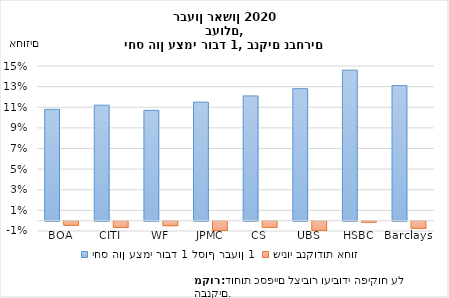
| Category | יחס הון עצמי רובד 1 לסוף רבעון 1 | שינוי בנקודות אחוז |
|---|---|---|
| BOA | 0.108 | -0.004 |
| CITI | 0.112 | -0.006 |
| WF | 0.107 | -0.004 |
| JPMC | 0.115 | -0.009 |
| CS | 0.121 | -0.006 |
| UBS | 0.128 | -0.009 |
| HSBC | 0.146 | -0.001 |
| Barclays | 0.131 | -0.007 |